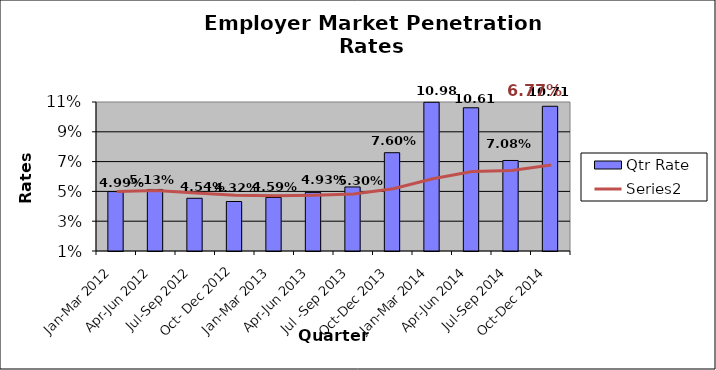
| Category | Qtr Rate |
|---|---|
| Jan-Mar 2012 | 0.05 |
| Apr-Jun 2012 | 0.051 |
| Jul-Sep 2012 | 0.045 |
| Oct- Dec 2012 | 0.043 |
| Jan-Mar 2013 | 0.046 |
| Apr-Jun 2013 | 0.049 |
| Jul -Sep 2013 | 0.053 |
| Oct-Dec 2013 | 0.076 |
| Jan-Mar 2014 | 0.11 |
| Apr-Jun 2014 | 0.106 |
| Jul-Sep 2014 | 0.071 |
| Oct-Dec 2014 | 0.107 |